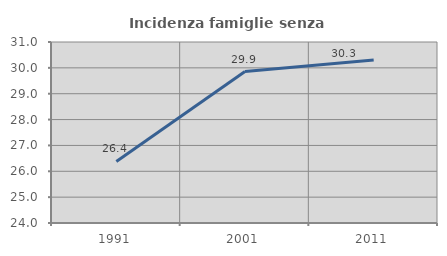
| Category | Incidenza famiglie senza nuclei |
|---|---|
| 1991.0 | 26.379 |
| 2001.0 | 29.856 |
| 2011.0 | 30.303 |